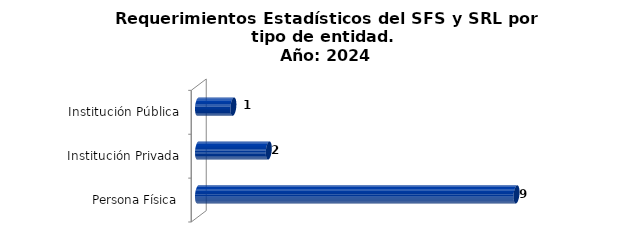
| Category | Total |
|---|---|
| Persona Física | 9 |
| Institución Privada | 2 |
| Institución Pública | 1 |